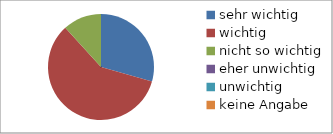
| Category | Series 0 |
|---|---|
| sehr wichtig | 5 |
| wichtig | 10 |
| nicht so wichtig | 2 |
| eher unwichtig | 0 |
| unwichtig | 0 |
| keine Angabe | 0 |